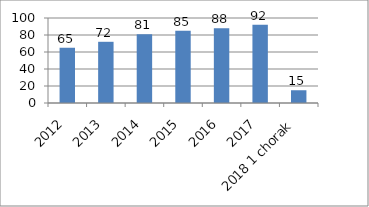
| Category | Series 0 |
|---|---|
| 2012 | 65 |
| 2013 | 72 |
| 2014 | 81 |
| 2015 | 85 |
| 2016 | 88 |
| 2017 | 92 |
| 2018 1 chorak | 15 |